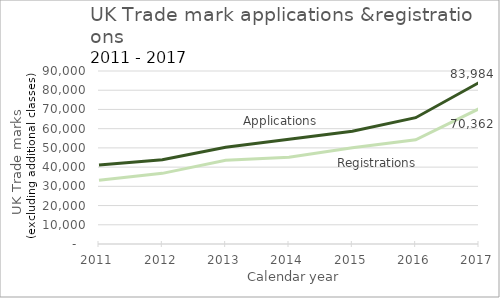
| Category | Applications | Registrations |
|---|---|---|
| 2011.0 | 41044 | 33172 |
| 2012.0 | 43873 | 36755 |
| 2013.0 | 50331 | 43548 |
| 2014.0 | 54498 | 45123 |
| 2015.0 | 58627 | 50079 |
| 2016.0 | 65710 | 54222 |
| 2017.0 | 83984 | 70362 |